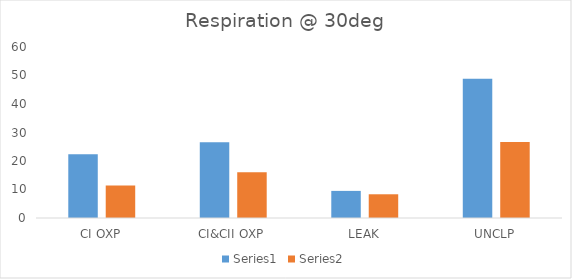
| Category | Series 0 | Series 1 |
|---|---|---|
| CI OXP | 22.326 | 11.37 |
| CI&CII OXP | 26.62 | 16.034 |
| LEAK | 9.509 | 8.324 |
| UNCLP | 48.883 | 26.709 |